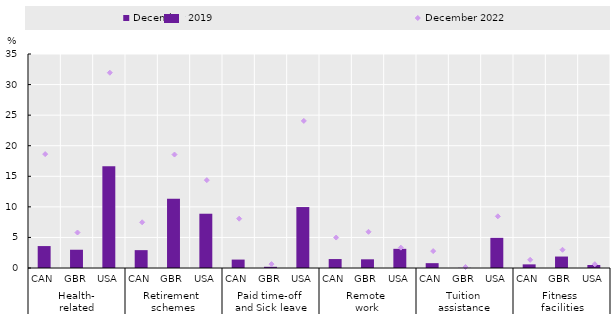
| Category | December 2019 |
|---|---|
| 0 | 3.587 |
| 1 | 2.986 |
| 2 | 16.629 |
| 3 | 2.921 |
| 4 | 11.308 |
| 5 | 8.877 |
| 6 | 1.377 |
| 7 | 0.198 |
| 8 | 9.969 |
| 9 | 1.463 |
| 10 | 1.421 |
| 11 | 3.136 |
| 12 | 0.791 |
| 13 | 0.027 |
| 14 | 4.933 |
| 15 | 0.595 |
| 16 | 1.875 |
| 17 | 0.486 |